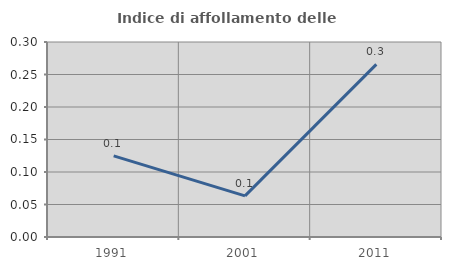
| Category | Indice di affollamento delle abitazioni  |
|---|---|
| 1991.0 | 0.125 |
| 2001.0 | 0.063 |
| 2011.0 | 0.266 |